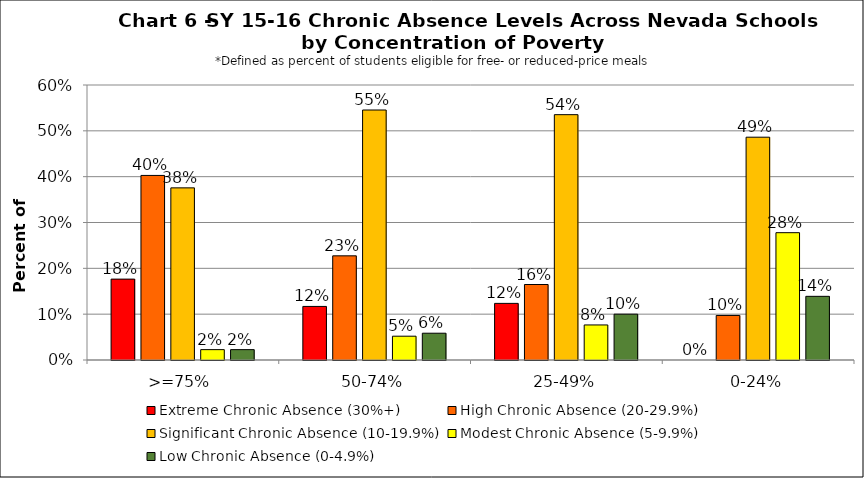
| Category | Extreme Chronic Absence (30%+) | High Chronic Absence (20-29.9%) | Significant Chronic Absence (10-19.9%) | Modest Chronic Absence (5-9.9%) | Low Chronic Absence (0-4.9%) |
|---|---|---|---|---|---|
| 0 | 0.176 | 0.403 | 0.376 | 0.023 | 0.023 |
| 1 | 0.117 | 0.227 | 0.545 | 0.052 | 0.058 |
| 2 | 0.124 | 0.165 | 0.535 | 0.076 | 0.1 |
| 3 | 0 | 0.097 | 0.486 | 0.278 | 0.139 |